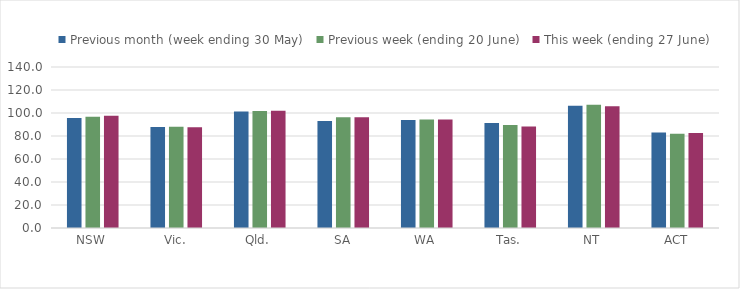
| Category | Previous month (week ending 30 May) | Previous week (ending 20 June) | This week (ending 27 June) |
|---|---|---|---|
| NSW | 95.706 | 96.831 | 97.558 |
| Vic. | 87.771 | 88.146 | 87.65 |
| Qld. | 101.345 | 101.83 | 101.955 |
| SA | 93.06 | 96.281 | 96.297 |
| WA | 93.834 | 94.25 | 94.313 |
| Tas. | 91.212 | 89.495 | 88.169 |
| NT | 106.202 | 107.235 | 105.953 |
| ACT | 83 | 82 | 82.62 |